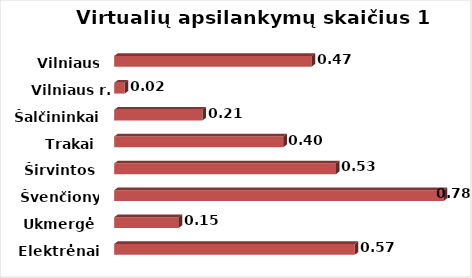
| Category | Series 0 |
|---|---|
| Elektrėnai | 0.571 |
| Ukmergė | 0.153 |
| Švenčionys | 0.782 |
| Širvintos | 0.526 |
| Trakai | 0.401 |
| Šalčininkai | 0.209 |
| Vilniaus r. | 0.025 |
| Vilniaus m. | 0.468 |